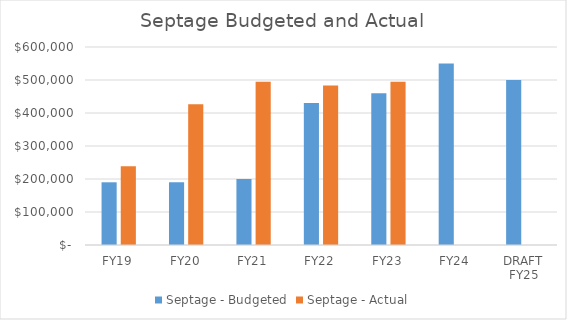
| Category | Septage - Budgeted | Septage - Actual |
|---|---|---|
| FY19 | 190000 | 238580 |
| FY20 | 190000 | 426533.73 |
| FY21 | 200000 | 494972.71 |
| FY22 | 430000 | 483577 |
| FY23 | 460000 | 495018 |
| FY24 | 550000 | 0 |
| DRAFT FY25 | 500000 | 0 |